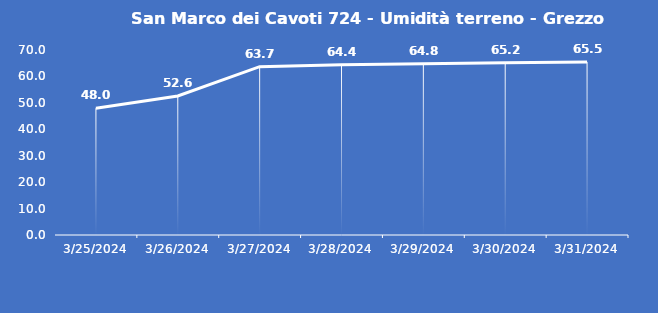
| Category | San Marco dei Cavoti 724 - Umidità terreno - Grezzo (%VWC) |
|---|---|
| 3/25/24 | 48 |
| 3/26/24 | 52.6 |
| 3/27/24 | 63.7 |
| 3/28/24 | 64.4 |
| 3/29/24 | 64.8 |
| 3/30/24 | 65.2 |
| 3/31/24 | 65.5 |